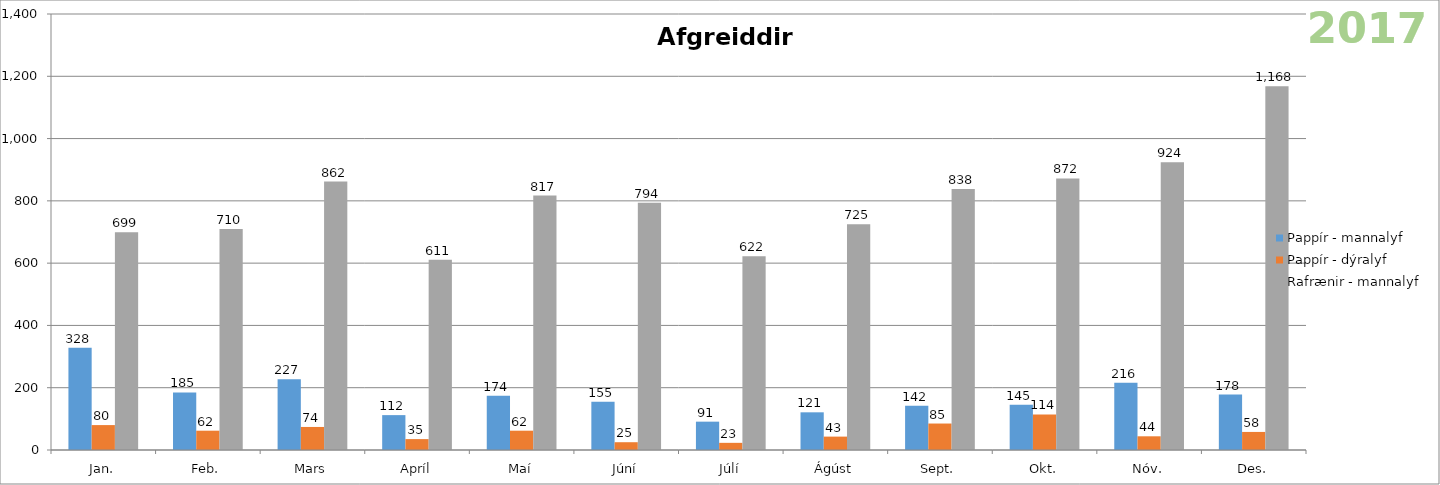
| Category | Pappír - mannalyf | Pappír - dýralyf | Rafrænir - mannalyf |
|---|---|---|---|
| Jan. | 328 | 80 | 699 |
| Feb. | 185 | 62 | 710 |
| Mars | 227 | 74 | 862 |
| Apríl | 112 | 35 | 611 |
| Maí | 174 | 62 | 817 |
| Júní | 155 | 25 | 794 |
| Júlí | 91 | 23 | 622 |
| Ágúst | 121 | 43 | 725 |
| Sept. | 142 | 85 | 838 |
| Okt. | 145 | 114 | 872 |
| Nóv. | 216 | 44 | 924 |
| Des. | 178 | 58 | 1168 |